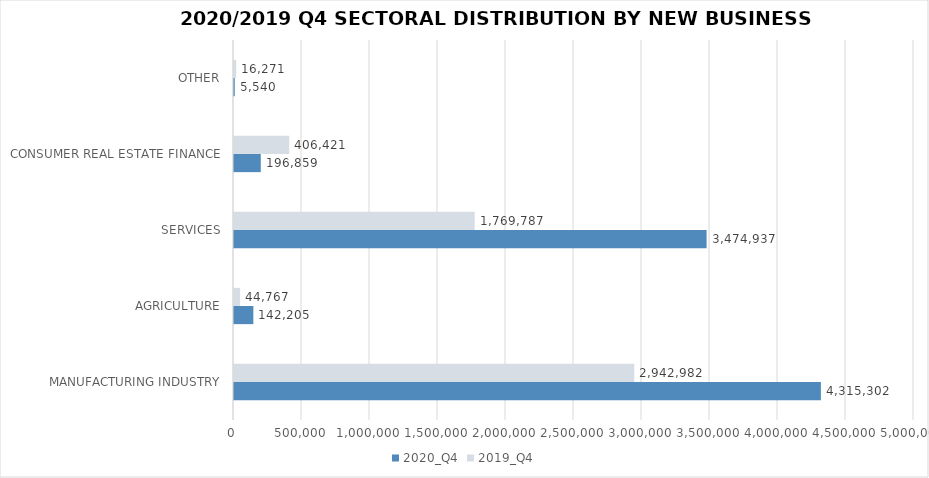
| Category | 2020_Q4 | 2019_Q4 |
|---|---|---|
| MANUFACTURING INDUSTRY | 4315302.094 | 2942981.64 |
| AGRICULTURE | 142205.005 | 44766.558 |
| SERVICES | 3474937.115 | 1769787.048 |
| CONSUMER REAL ESTATE FINANCE | 196859 | 406421 |
| OTHER | 5540 | 16271 |